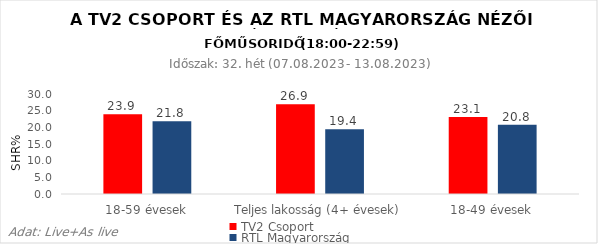
| Category | TV2 Csoport | RTL Magyarország |
|---|---|---|
| 18-59 évesek | 23.9 | 21.8 |
| Teljes lakosság (4+ évesek) | 26.9 | 19.4 |
| 18-49 évesek | 23.1 | 20.8 |